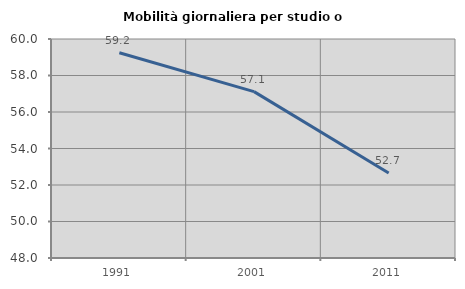
| Category | Mobilità giornaliera per studio o lavoro |
|---|---|
| 1991.0 | 59.245 |
| 2001.0 | 57.115 |
| 2011.0 | 52.661 |